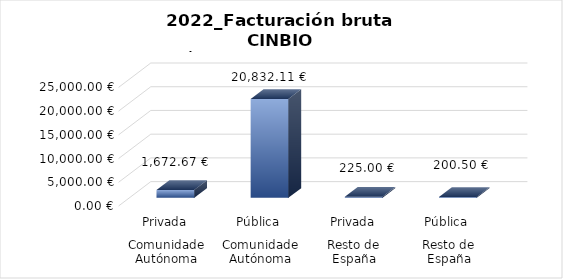
| Category | Series 0 |
|---|---|
| 0 | 1672.669 |
| 1 | 20832.105 |
| 2 | 225 |
| 3 | 200.504 |